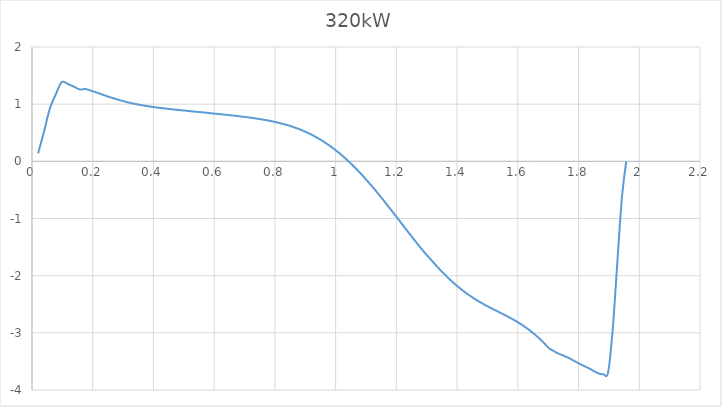
| Category | 320kW |
|---|---|
| 0.02 | 0.139 |
| 0.039 | 0.508 |
| 0.059 | 0.926 |
| 0.079 | 1.181 |
| 0.098 | 1.387 |
| 0.118 | 1.353 |
| 0.138 | 1.306 |
| 0.157 | 1.258 |
| 0.177 | 1.264 |
| 0.196 | 1.233 |
| 0.216 | 1.198 |
| 0.236 | 1.161 |
| 0.255 | 1.125 |
| 0.275 | 1.092 |
| 0.295 | 1.061 |
| 0.314 | 1.034 |
| 0.334 | 1.01 |
| 0.354 | 0.99 |
| 0.373 | 0.971 |
| 0.393 | 0.955 |
| 0.413 | 0.941 |
| 0.432 | 0.928 |
| 0.452 | 0.916 |
| 0.471 | 0.905 |
| 0.491 | 0.894 |
| 0.511 | 0.884 |
| 0.53 | 0.873 |
| 0.55 | 0.863 |
| 0.57 | 0.852 |
| 0.589 | 0.841 |
| 0.609 | 0.831 |
| 0.629 | 0.82 |
| 0.648 | 0.809 |
| 0.668 | 0.797 |
| 0.688 | 0.785 |
| 0.707 | 0.772 |
| 0.727 | 0.758 |
| 0.746 | 0.742 |
| 0.766 | 0.725 |
| 0.786 | 0.705 |
| 0.805 | 0.683 |
| 0.825 | 0.657 |
| 0.845 | 0.628 |
| 0.864 | 0.594 |
| 0.884 | 0.555 |
| 0.891 | 0.539 |
| 0.906 | 0.504 |
| 0.921 | 0.465 |
| 0.936 | 0.423 |
| 0.951 | 0.376 |
| 0.966 | 0.325 |
| 0.981 | 0.271 |
| 0.996 | 0.211 |
| 1.011 | 0.148 |
| 1.026 | 0.08 |
| 1.041 | 0.008 |
| 1.056 | -0.069 |
| 1.071 | -0.149 |
| 1.086 | -0.233 |
| 1.101 | -0.321 |
| 1.116 | -0.413 |
| 1.131 | -0.507 |
| 1.146 | -0.604 |
| 1.161 | -0.704 |
| 1.176 | -0.805 |
| 1.191 | -0.907 |
| 1.206 | -1.01 |
| 1.221 | -1.114 |
| 1.236 | -1.217 |
| 1.251 | -1.319 |
| 1.266 | -1.42 |
| 1.281 | -1.519 |
| 1.296 | -1.615 |
| 1.312 | -1.709 |
| 1.327 | -1.799 |
| 1.342 | -1.886 |
| 1.357 | -1.968 |
| 1.372 | -2.046 |
| 1.387 | -2.12 |
| 1.402 | -2.189 |
| 1.417 | -2.253 |
| 1.432 | -2.313 |
| 1.447 | -2.368 |
| 1.462 | -2.42 |
| 1.477 | -2.467 |
| 1.492 | -2.512 |
| 1.507 | -2.555 |
| 1.522 | -2.595 |
| 1.537 | -2.635 |
| 1.552 | -2.675 |
| 1.567 | -2.716 |
| 1.582 | -2.759 |
| 1.597 | -2.805 |
| 1.612 | -2.855 |
| 1.627 | -2.909 |
| 1.642 | -2.969 |
| 1.657 | -3.034 |
| 1.672 | -3.105 |
| 1.687 | -3.183 |
| 1.702 | -3.266 |
| 1.717 | -3.315 |
| 1.732 | -3.359 |
| 1.747 | -3.391 |
| 1.762 | -3.426 |
| 1.777 | -3.466 |
| 1.792 | -3.51 |
| 1.807 | -3.551 |
| 1.822 | -3.59 |
| 1.837 | -3.629 |
| 1.852 | -3.674 |
| 1.867 | -3.713 |
| 1.882 | -3.724 |
| 1.897 | -3.699 |
| 1.912 | -2.976 |
| 1.927 | -1.827 |
| 1.942 | -0.68 |
| 1.957 | 0 |